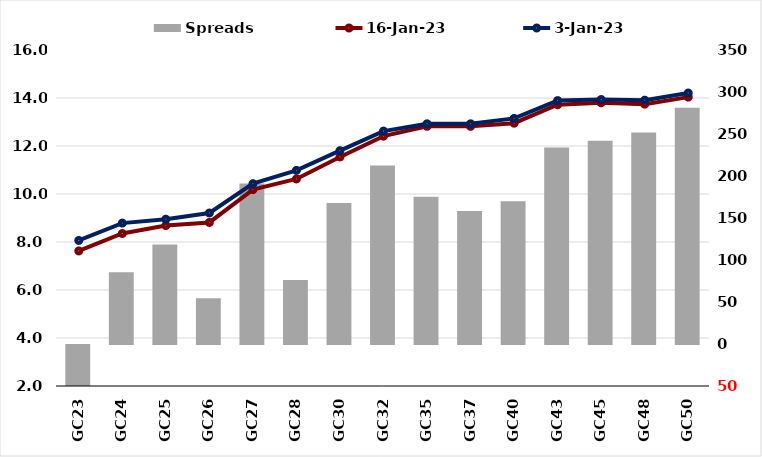
| Category |  Spreads   |
|---|---|
| GC23 | -130.925 |
| GC24 | 85.394 |
| GC25 | 118.483 |
| GC26 | 54.461 |
| GC27 | 191.193 |
| GC28 | 76.189 |
| GC30 | 167.993 |
| GC32 | 212.45 |
| GC35 | 175.35 |
| GC37 | 158.35 |
| GC40 | 169.974 |
| GC43 | 233.968 |
| GC45 | 242.069 |
| GC48 | 251.841 |
| GC50 | 281.242 |